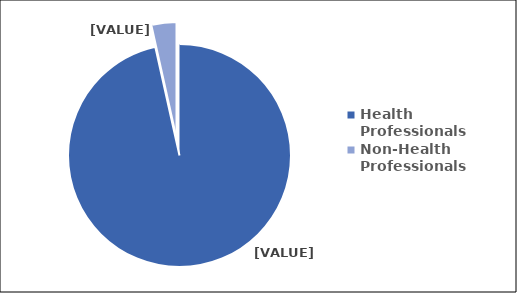
| Category | Series 0 |
|---|---|
| Health Professionals | 96.514 |
| Non-Health Professionals | 3.486 |